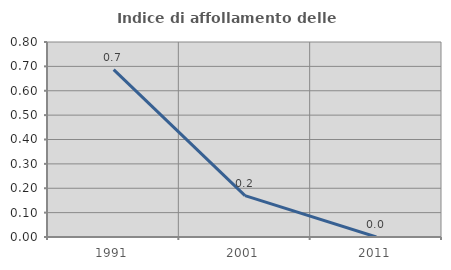
| Category | Indice di affollamento delle abitazioni  |
|---|---|
| 1991.0 | 0.687 |
| 2001.0 | 0.169 |
| 2011.0 | 0 |